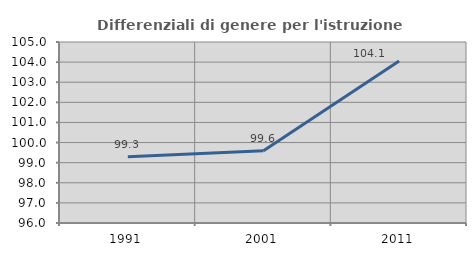
| Category | Differenziali di genere per l'istruzione superiore |
|---|---|
| 1991.0 | 99.291 |
| 2001.0 | 99.594 |
| 2011.0 | 104.057 |